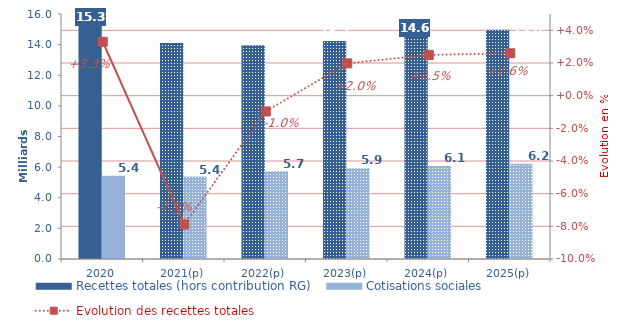
| Category | Recettes totales (hors contribution RG) | Cotisations sociales |
|---|---|---|
| 2020 | 15305.066 | 5435.204 |
| 2021(p) | 14098.777 | 5389.237 |
| 2022(p) | 13962.723 | 5727.209 |
| 2023(p) | 14238.89 | 5926.211 |
| 2024(p) | 14594.444 | 6076.584 |
| 2025(p) | 14972.947 | 6214.744 |